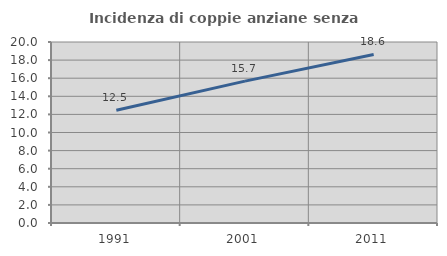
| Category | Incidenza di coppie anziane senza figli  |
|---|---|
| 1991.0 | 12.46 |
| 2001.0 | 15.674 |
| 2011.0 | 18.628 |